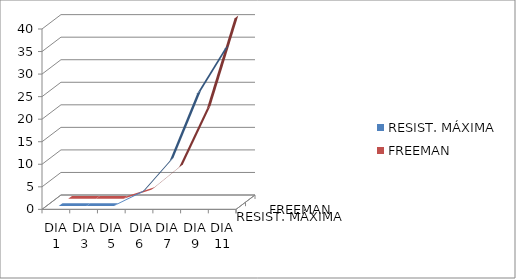
| Category | RESIST. MÁXIMA | FREEMAN |
|---|---|---|
| DIA 1 | 0 | 0 |
| DIA 3 | 0 | 0 |
| DIA 5 | 0 | 0 |
|  DIA 6 | 3 | 2 |
| DIA 7 | 10 | 7 |
| DIA 9 | 25 | 20 |
| DIA 11 | 35 | 40 |